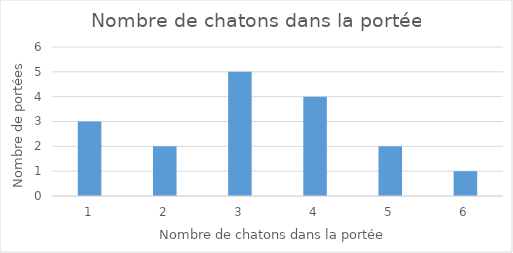
| Category | Series 0 |
|---|---|
| 1.0 | 3 |
| 2.0 | 2 |
| 3.0 | 5 |
| 4.0 | 4 |
| 5.0 | 2 |
| 6.0 | 1 |